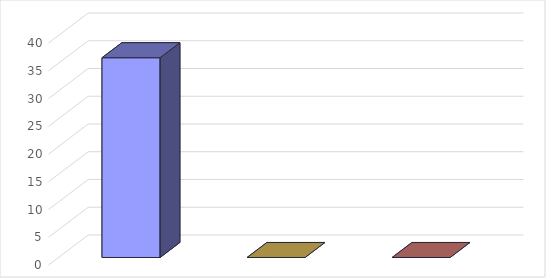
| Category | Series 0 |
|---|---|
| 0 | 36 |
| 1 | 0 |
| 2 | 0 |